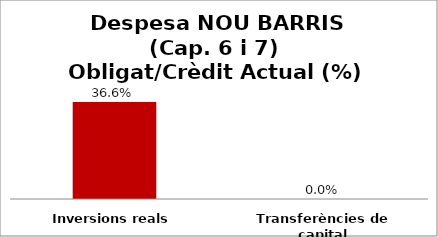
| Category | Series 0 |
|---|---|
| Inversions reals | 0.366 |
| Transferències de capital | 0 |